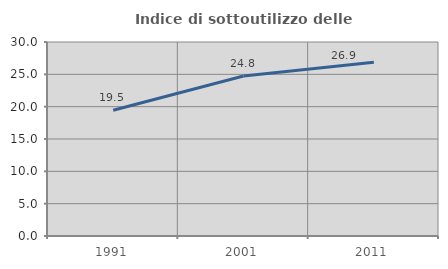
| Category | Indice di sottoutilizzo delle abitazioni  |
|---|---|
| 1991.0 | 19.453 |
| 2001.0 | 24.753 |
| 2011.0 | 26.857 |